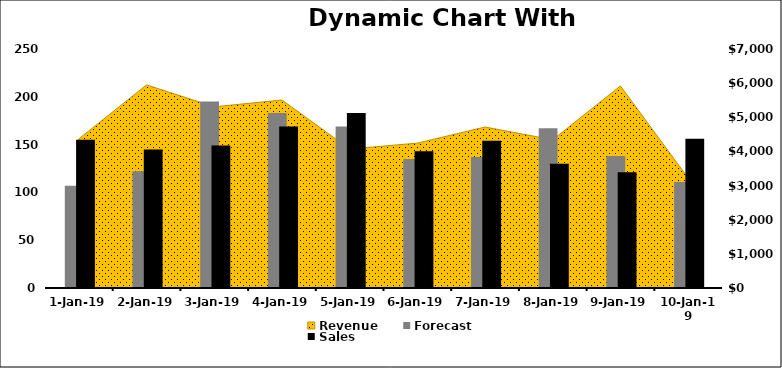
| Category | Forecast | Sales |
|---|---|---|
| 2019-01-01 | 107 | 155 |
| 2019-01-02 | 122 | 145 |
| 2019-01-03 | 195 | 149 |
| 2019-01-04 | 183 | 169 |
| 2019-01-05 | 169 | 183 |
| 2019-01-06 | 135 | 143 |
| 2019-01-07 | 137 | 154 |
| 2019-01-08 | 167 | 130 |
| 2019-01-09 | 138 | 121 |
| 2019-01-10 | 111 | 156 |